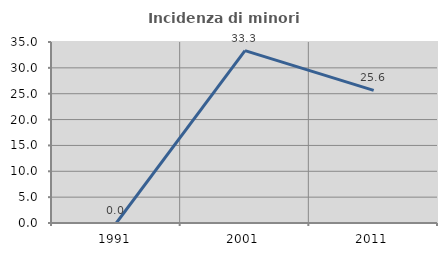
| Category | Incidenza di minori stranieri |
|---|---|
| 1991.0 | 0 |
| 2001.0 | 33.333 |
| 2011.0 | 25.641 |